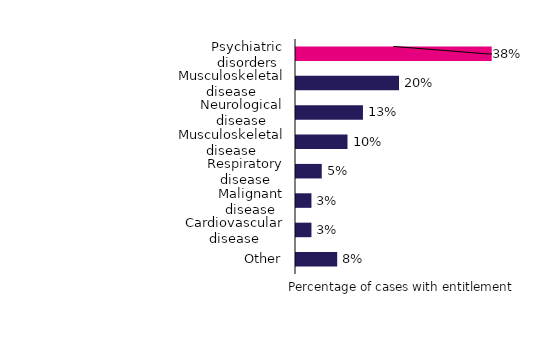
| Category | Percentage of cases |
|---|---|
| Psychiatric disorders | 0.38 |
| Musculoskeletal disease (general) | 0.2 |
| Neurological disease | 0.13 |
| Musculoskeletal disease (regional) | 0.1 |
| Respiratory disease | 0.05 |
| Malignant disease | 0.03 |
| Cardiovascular disease | 0.03 |
| Other | 0.08 |